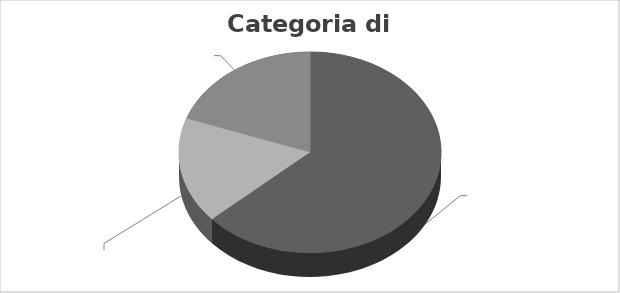
| Category | Series 0 |
|---|---|
| NO | 52 |
| PARZIALMENTE  | 14 |
| SI | 16 |